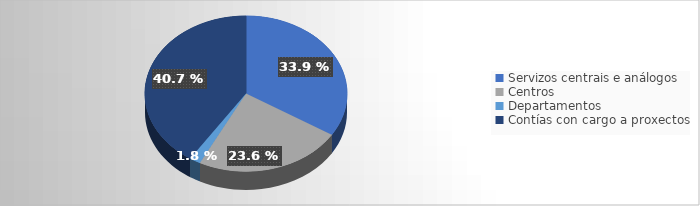
| Category | Series 0 |
|---|---|
| Servizos centrais e análogos | 50412.83 |
| Centros | 35178.19 |
| Departamentos | 2630.72 |
| Contías con cargo a proxectos | 60577.58 |